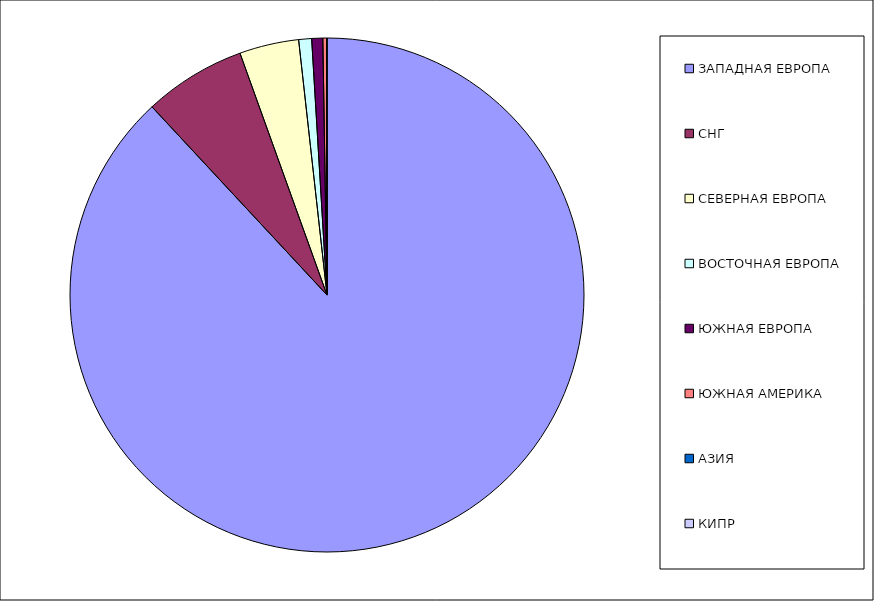
| Category | Оборот |
|---|---|
| ЗАПАДНАЯ ЕВРОПА | 0.881 |
| СНГ | 0.064 |
| СЕВЕРНАЯ ЕВРОПА | 0.037 |
| ВОСТОЧНАЯ ЕВРОПА | 0.008 |
| ЮЖНАЯ ЕВРОПА | 0.007 |
| ЮЖНАЯ АМЕРИКА | 0.002 |
| АЗИЯ | 0 |
| КИПР | 0 |